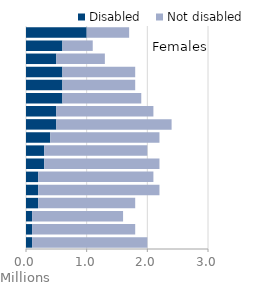
| Category | Disabled | Not disabled |
|---|---|---|
| 0-4 | 0.1 | 1.9 |
| 5-9 | 0.1 | 1.7 |
| 10-14 | 0.1 | 1.5 |
| 15-19 | 0.2 | 1.6 |
| 20-24 | 0.2 | 2 |
| 25-29 | 0.2 | 1.9 |
| 30-34 | 0.3 | 1.9 |
| 35-39 | 0.3 | 1.7 |
| 40-44 | 0.4 | 1.8 |
| 45-49 | 0.5 | 1.9 |
| 50-54 | 0.5 | 1.6 |
| 55-59 | 0.6 | 1.3 |
| 60-64 | 0.6 | 1.2 |
| 65-69 | 0.6 | 1.2 |
| 70-74 | 0.5 | 0.8 |
| 75-79 | 0.6 | 0.5 |
| 80+ | 1 | 0.7 |